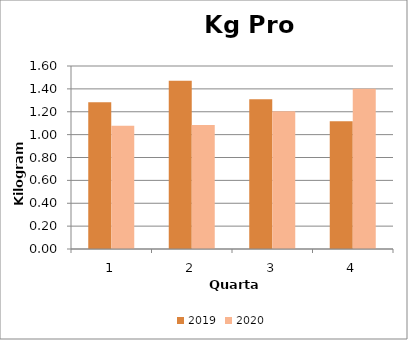
| Category | 2019 | 2020 |
|---|---|---|
| 0 | 1.283 | 1.077 |
| 1 | 1.472 | 1.084 |
| 2 | 1.309 | 1.204 |
| 3 | 1.116 | 1.4 |